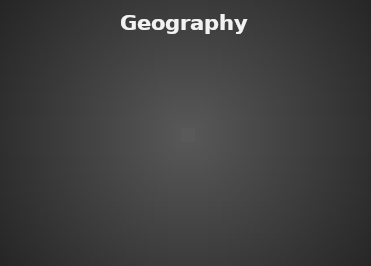
| Category | Geography Economics |
|---|---|
| % of Students passed | 0 |
| % of Students need improvement | 0 |